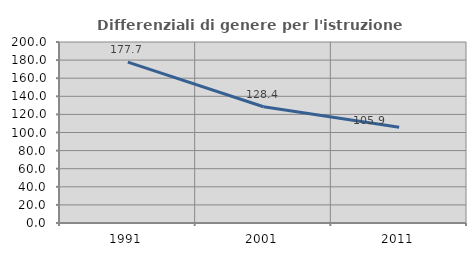
| Category | Differenziali di genere per l'istruzione superiore |
|---|---|
| 1991.0 | 177.746 |
| 2001.0 | 128.431 |
| 2011.0 | 105.854 |